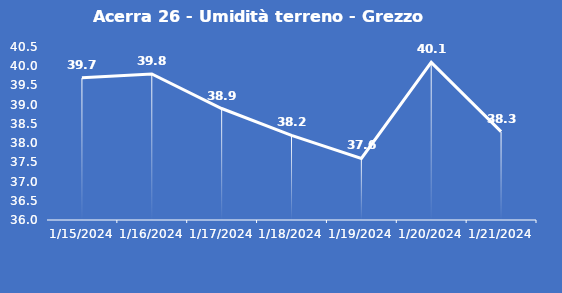
| Category | Acerra 26 - Umidità terreno - Grezzo (%VWC) |
|---|---|
| 1/15/24 | 39.7 |
| 1/16/24 | 39.8 |
| 1/17/24 | 38.9 |
| 1/18/24 | 38.2 |
| 1/19/24 | 37.6 |
| 1/20/24 | 40.1 |
| 1/21/24 | 38.3 |